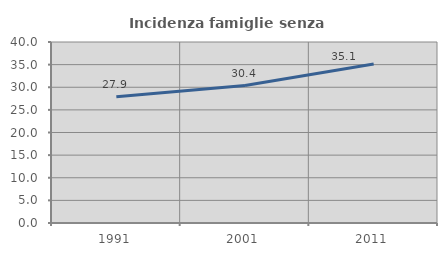
| Category | Incidenza famiglie senza nuclei |
|---|---|
| 1991.0 | 27.9 |
| 2001.0 | 30.367 |
| 2011.0 | 35.139 |